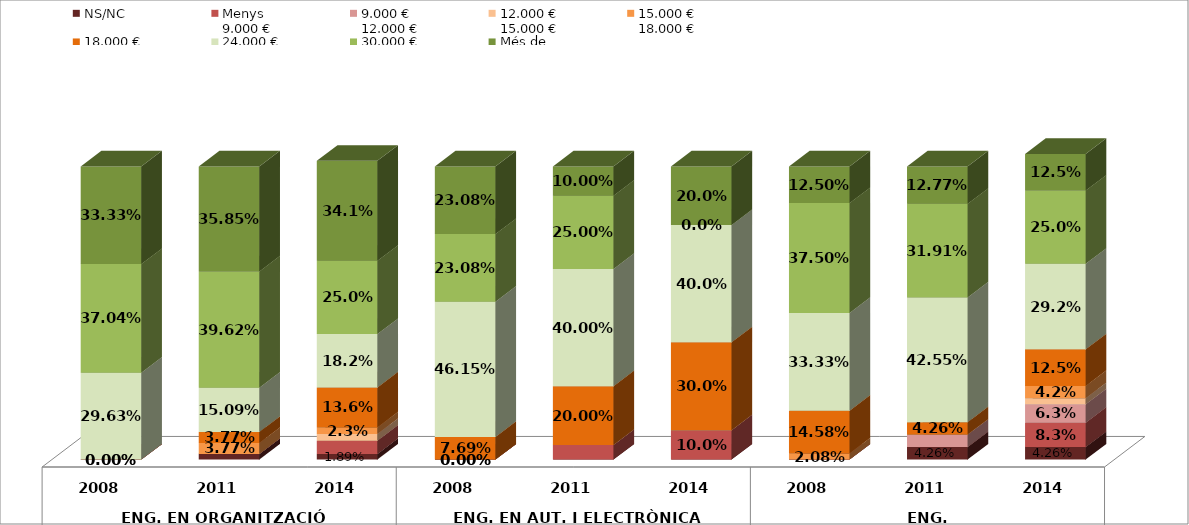
| Category | NS/NC | Menys 
9.000 € | 9.000 €
12.000 € | 12.000 €
15.000 € | 15.000 €
18.000 € | 18.000 €
24.000 € | 24.000 €
30.000 € | 30.000 €
40.000 € | Més de 
40.000 € |
|---|---|---|---|---|---|---|---|---|---|
| 0 | 0 | 0 | 0 | 0 | 0 | 0 | 0.296 | 0.37 | 0.333 |
| 1 | 0.019 | 0 | 0 | 0 | 0.038 | 0.038 | 0.151 | 0.396 | 0.358 |
| 2 | 0.019 | 0.045 | 0 | 0.023 | 0.023 | 0.136 | 0.182 | 0.25 | 0.341 |
| 3 | 0 | 0 | 0 | 0 | 0 | 0.077 | 0.462 | 0.231 | 0.231 |
| 4 | 0 | 0.05 | 0 | 0 | 0 | 0.2 | 0.4 | 0.25 | 0.1 |
| 5 | 0 | 0.1 | 0 | 0 | 0 | 0.3 | 0.4 | 0 | 0.2 |
| 6 | 0 | 0 | 0 | 0 | 0.021 | 0.146 | 0.333 | 0.375 | 0.125 |
| 7 | 0.043 | 0 | 0.043 | 0 | 0 | 0.043 | 0.426 | 0.319 | 0.128 |
| 8 | 0.043 | 0.083 | 0.062 | 0.021 | 0.042 | 0.125 | 0.292 | 0.25 | 0.125 |